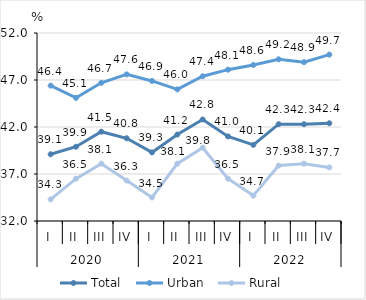
| Category | Total | Urban | Rural |
|---|---|---|---|
| 0 | 39.1 | 46.4 | 34.3 |
| 1 | 39.9 | 45.1 | 36.5 |
| 2 | 41.5 | 46.7 | 38.1 |
| 3 | 40.8 | 47.6 | 36.3 |
| 4 | 39.3 | 46.9 | 34.5 |
| 5 | 41.2 | 46 | 38.1 |
| 6 | 42.8 | 47.4 | 39.8 |
| 7 | 41 | 48.1 | 36.5 |
| 8 | 40.1 | 48.6 | 34.7 |
| 9 | 42.3 | 49.2 | 37.9 |
| 10 | 42.3 | 48.9 | 38.1 |
| 11 | 42.4 | 49.7 | 37.7 |